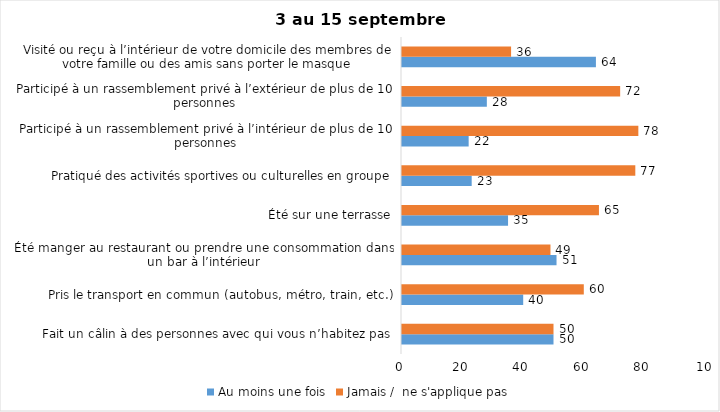
| Category | Au moins une fois | Jamais /  ne s'applique pas |
|---|---|---|
| Fait un câlin à des personnes avec qui vous n’habitez pas | 50 | 50 |
| Pris le transport en commun (autobus, métro, train, etc.) | 40 | 60 |
| Été manger au restaurant ou prendre une consommation dans un bar à l’intérieur | 51 | 49 |
| Été sur une terrasse | 35 | 65 |
| Pratiqué des activités sportives ou culturelles en groupe | 23 | 77 |
| Participé à un rassemblement privé à l’intérieur de plus de 10 personnes | 22 | 78 |
| Participé à un rassemblement privé à l’extérieur de plus de 10 personnes | 28 | 72 |
| Visité ou reçu à l’intérieur de votre domicile des membres de votre famille ou des amis sans porter le masque | 64 | 36 |